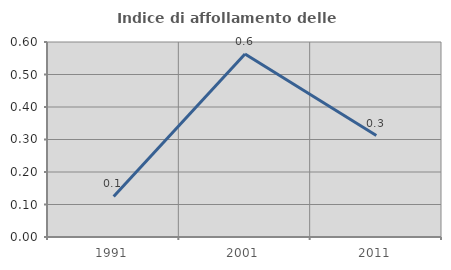
| Category | Indice di affollamento delle abitazioni  |
|---|---|
| 1991.0 | 0.125 |
| 2001.0 | 0.563 |
| 2011.0 | 0.312 |